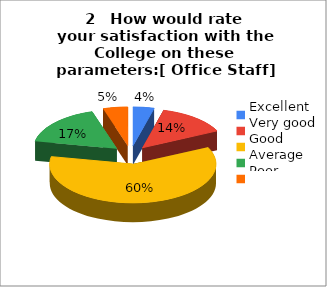
| Category | 2   How would rate
your satisfaction with the College on these parameters:                             [ Office Staff] |
|---|---|
| Excellent | 6 |
| Very good | 20 |
| Good | 88 |
| Average | 25 |
| Poor | 7 |